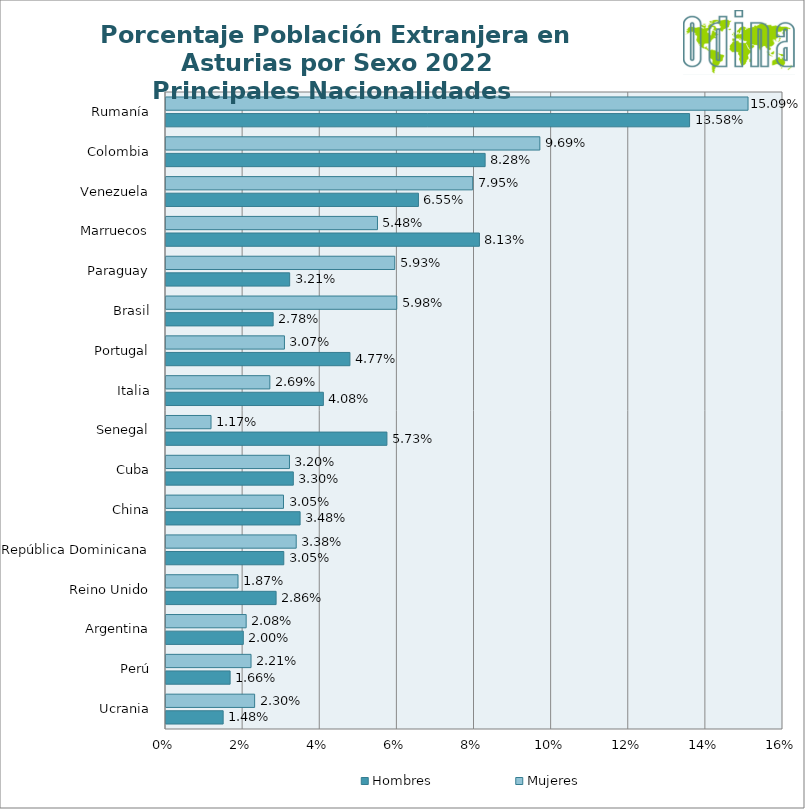
| Category | Hombres | Mujeres |
|---|---|---|
| Ucrania | 0.015 | 0.023 |
| Perú | 0.017 | 0.022 |
| Argentina | 0.02 | 0.021 |
| Reino Unido | 0.029 | 0.019 |
| República Dominicana | 0.031 | 0.034 |
| China | 0.035 | 0.03 |
| Cuba | 0.033 | 0.032 |
| Senegal | 0.057 | 0.012 |
| Italia | 0.041 | 0.027 |
| Portugal | 0.048 | 0.031 |
| Brasil | 0.028 | 0.06 |
| Paraguay | 0.032 | 0.059 |
| Marruecos | 0.081 | 0.055 |
| Venezuela | 0.065 | 0.08 |
| Colombia | 0.083 | 0.097 |
| Rumanía | 0.136 | 0.151 |